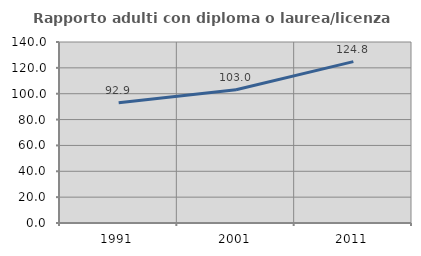
| Category | Rapporto adulti con diploma o laurea/licenza media  |
|---|---|
| 1991.0 | 92.929 |
| 2001.0 | 103.008 |
| 2011.0 | 124.828 |